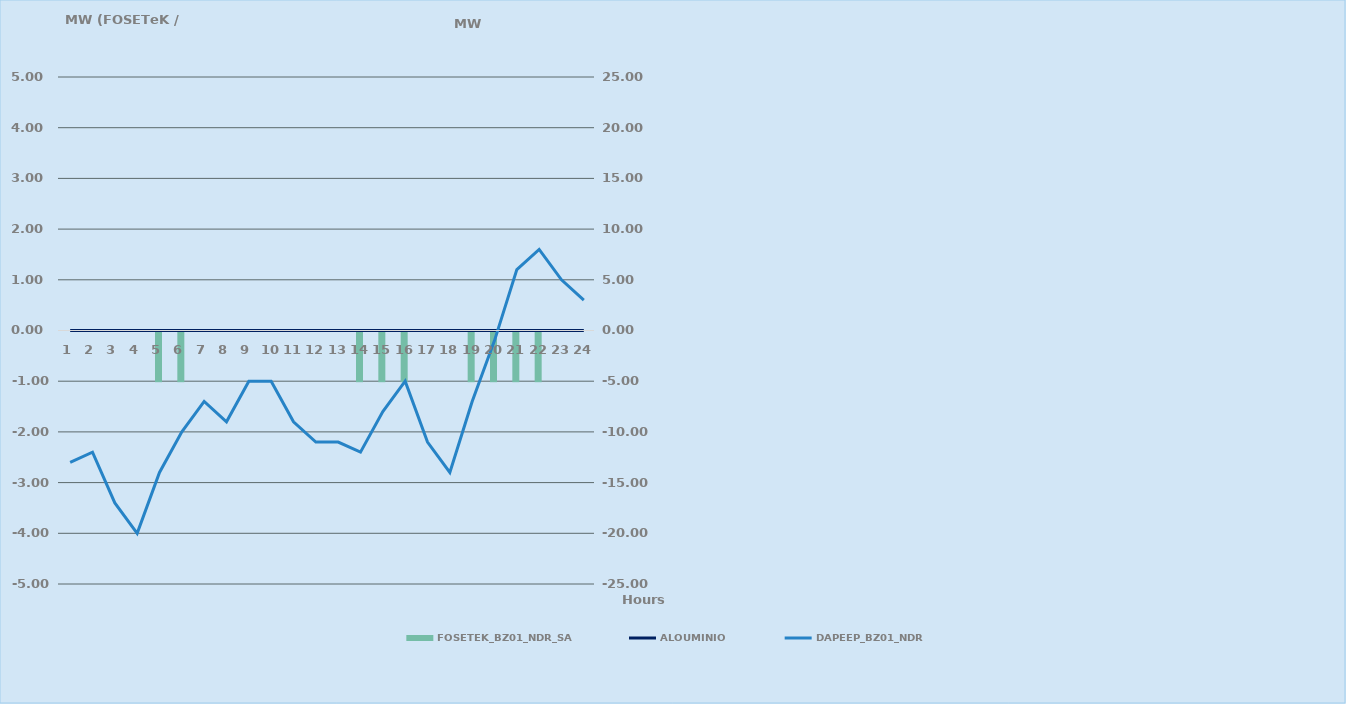
| Category | FOSETEK_BZ01_NDR_SA |
|---|---|
| 0 | 0 |
| 1 | 0 |
| 2 | 0 |
| 3 | 0 |
| 4 | -1 |
| 5 | -1 |
| 6 | 0 |
| 7 | 0 |
| 8 | 0 |
| 9 | 0 |
| 10 | 0 |
| 11 | 0 |
| 12 | 0 |
| 13 | -1 |
| 14 | -1 |
| 15 | -1 |
| 16 | 0 |
| 17 | 0 |
| 18 | -1 |
| 19 | -1 |
| 20 | -1 |
| 21 | -1 |
| 22 | 0 |
| 23 | 0 |